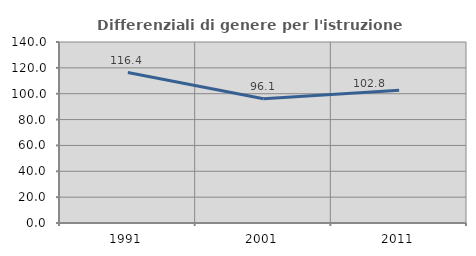
| Category | Differenziali di genere per l'istruzione superiore |
|---|---|
| 1991.0 | 116.363 |
| 2001.0 | 96.065 |
| 2011.0 | 102.763 |